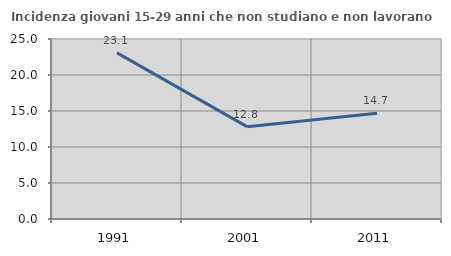
| Category | Incidenza giovani 15-29 anni che non studiano e non lavorano  |
|---|---|
| 1991.0 | 23.077 |
| 2001.0 | 12.827 |
| 2011.0 | 14.692 |